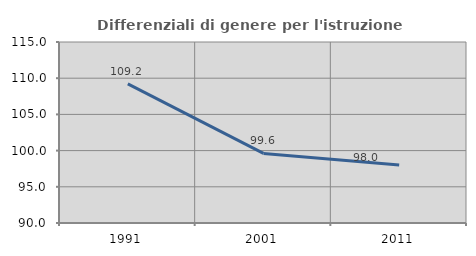
| Category | Differenziali di genere per l'istruzione superiore |
|---|---|
| 1991.0 | 109.21 |
| 2001.0 | 99.607 |
| 2011.0 | 98.027 |